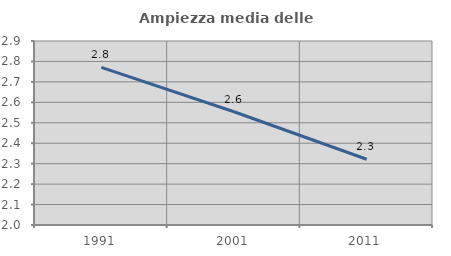
| Category | Ampiezza media delle famiglie |
|---|---|
| 1991.0 | 2.771 |
| 2001.0 | 2.554 |
| 2011.0 | 2.322 |